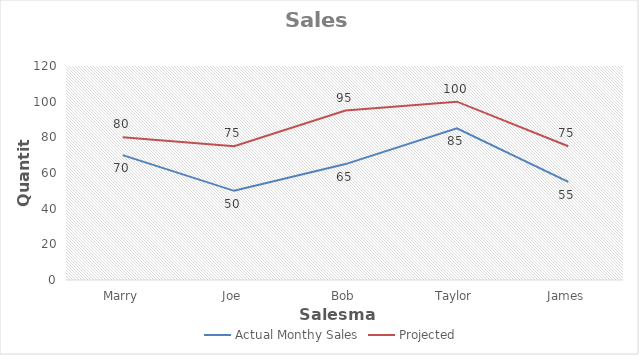
| Category | Actual Monthy Sales | Projected |
|---|---|---|
| Marry | 70 | 80 |
| Joe | 50 | 75 |
| Bob | 65 | 95 |
| Taylor | 85 | 100 |
| James | 55 | 75 |